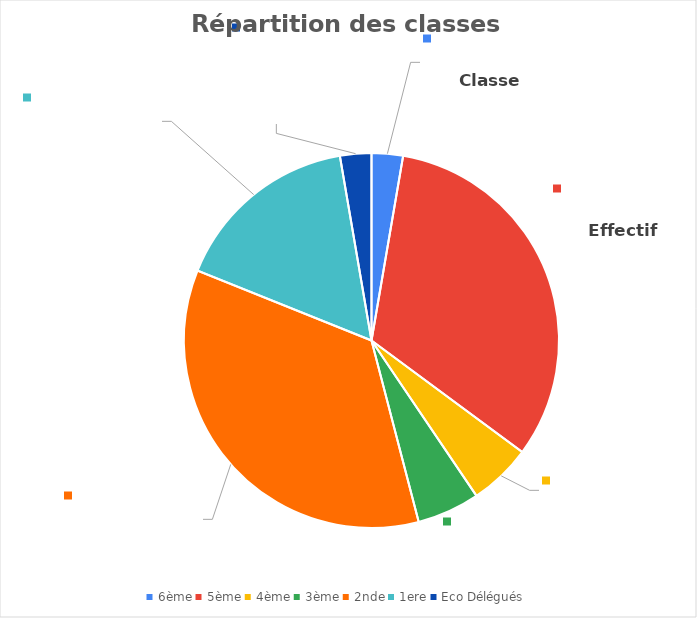
| Category | Series 0 |
|---|---|
| 6ème | 1 |
| 5ème | 12 |
| 4ème | 2 |
| 3ème | 2 |
| 2nde | 13 |
| 1ere | 6 |
| Eco Délégués | 1 |